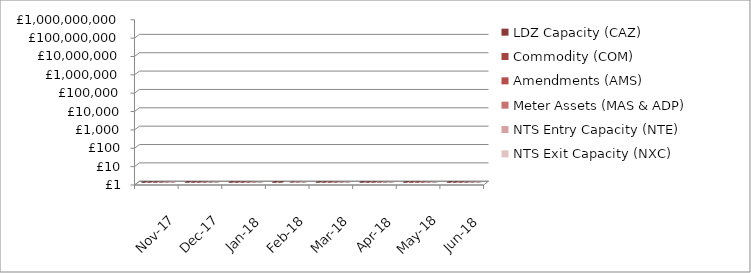
| Category | LDZ Capacity (CAZ) | Commodity (COM) | Amendments (AMS) | Meter Assets (MAS & ADP) | NTS Entry Capacity (NTE) | NTS Exit Capacity (NXC) |
|---|---|---|---|---|---|---|
| 2017-11-01 | 290194555.87 | 41901625.24 | 281193.04 | 187587.95 | 12089719.21 | 18734838.83 |
| 2017-12-01 | 299923728.54 | 49314715.49 | 486751.91 | 193840.34 | 12089719.21 | 18734838.83 |
| 2018-01-01 | 300085873.04 | 51013861.41 | 398601 | 193840 | 13468961.26 | 18693319.21 |
| 2018-02-01 | 271243893.07 | 49577294.91 | -97584.69 | 175082.41 | 10887736.94 | 16944144.32 |
| 2018-03-01 | 300714752.62 | 47885458.16 | 435828.94 | 193565.33 | 12522228.64 | 16944144.32 |
| 2018-04-01 | 302200317.27 | 29034584.31 | 1543453.44 | 194233.3 | 1577511.57 | 18111359.22 |
| 2018-05-01 | 312174512.16 | 19449237 | 2024085.07 | 200707.08 | 1599795.55 | 18702620.75 |
| 2018-06-01 | 302299412.99 | 14591606.04 | 2213969.29 | 194233.54 | 1621553.61 | 18117525.2 |